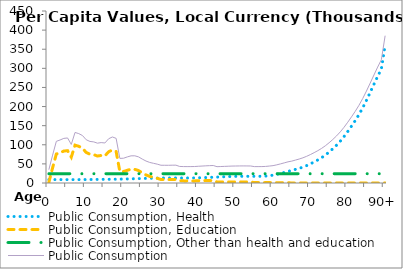
| Category | Public Consumption, Health | Public Consumption, Education | Public Consumption, Other than health and education | Public Consumption |
|---|---|---|---|---|
| 0 | 8886.3 | 1683.394 | 24310.147 | 34879.841 |
|  | 8886.3 | 39695.76 | 24310.147 | 72892.206 |
| 2 | 8886.3 | 75808.341 | 24310.147 | 109004.787 |
| 3 | 8886.3 | 79378.98 | 24310.147 | 112575.426 |
| 4 | 8886.3 | 83548.309 | 24310.147 | 116744.755 |
| 5 | 8886.3 | 84640.315 | 24310.147 | 117836.761 |
| 6 | 8886.3 | 67719.116 | 24310.147 | 100915.563 |
| 7 | 8889.363 | 99023.447 | 24310.147 | 132222.957 |
| 8 | 8906.819 | 96012.027 | 24310.147 | 129228.992 |
| 9 | 8947.693 | 90871.496 | 24310.147 | 124129.336 |
| 10 | 9014.393 | 79808.508 | 24310.147 | 113133.048 |
| 11 | 9103.403 | 75315.585 | 24310.147 | 108729.135 |
| 12 | 9208.155 | 74071.104 | 24310.147 | 107589.406 |
| 13 | 9321.862 | 70594.53 | 24310.147 | 104226.538 |
| 14 | 9439.269 | 71991.213 | 24310.147 | 105740.628 |
| 15 | 9557.561 | 70862.256 | 24310.147 | 104729.964 |
| 16 | 9675.72 | 81791.858 | 24310.147 | 115777.724 |
| 17 | 9798.338 | 86255.72 | 24310.147 | 120364.205 |
| 18 | 9947.251 | 82592.397 | 24310.147 | 116849.796 |
| 19 | 10137.665 | 29873.063 | 24310.147 | 64320.875 |
| 20 | 10368.694 | 30196.056 | 24310.147 | 64874.897 |
| 21 | 10628.242 | 33355.121 | 24310.147 | 68293.51 |
| 22 | 10902.519 | 35867.907 | 24310.147 | 71080.572 |
| 23 | 11183.609 | 35666.717 | 24310.147 | 71160.472 |
| 24 | 11469.481 | 32538.88 | 24310.147 | 68318.508 |
| 25 | 11756.177 | 26493.437 | 24310.147 | 62559.761 |
| 26 | 12041.297 | 21106.336 | 24310.147 | 57457.779 |
| 27 | 12317.927 | 17165.314 | 24310.147 | 53793.387 |
| 28 | 12573.061 | 14642.946 | 24310.147 | 51526.154 |
| 29 | 12789.913 | 12227.189 | 24310.147 | 49327.249 |
| 30 | 12952.413 | 9193.019 | 24310.147 | 46455.578 |
| 31 | 13051.994 | 9013.917 | 24310.147 | 46376.058 |
| 32 | 13094.433 | 8921.66 | 24310.147 | 46326.239 |
| 33 | 13101.984 | 9178.733 | 24310.147 | 46590.863 |
| 34 | 13101.984 | 9239.283 | 24310.147 | 46651.413 |
| 35 | 13101.984 | 5885.431 | 24310.147 | 43297.561 |
| 36 | 13101.984 | 5566.392 | 24310.147 | 42978.522 |
| 37 | 13113.143 | 5489.964 | 24310.147 | 42913.254 |
| 38 | 13175.873 | 5471.257 | 24310.147 | 42957.277 |
| 39 | 13323.063 | 5466.551 | 24310.147 | 43099.76 |
| 40 | 13563.253 | 5869.607 | 24310.147 | 43743.006 |
| 41 | 13883.78 | 6141.374 | 24310.147 | 44335.301 |
| 42 | 14260.821 | 6329.827 | 24310.147 | 44900.795 |
| 43 | 14669.303 | 6407.946 | 24310.147 | 45387.396 |
| 44 | 15089.794 | 6345.566 | 24310.147 | 45745.507 |
| 45 | 15512.02 | 2887.684 | 24310.147 | 42709.851 |
| 46 | 15932.512 | 2848.984 | 24310.147 | 43091.642 |
| 47 | 16340.994 | 2835.708 | 24310.147 | 43486.848 |
| 48 | 16718.035 | 2874.449 | 24310.147 | 43902.63 |
| 49 | 17038.561 | 2931.93 | 24310.147 | 44280.637 |
| 50 | 17278.751 | 2862.721 | 24310.147 | 44451.618 |
| 51 | 17425.942 | 2881.717 | 24310.147 | 44617.805 |
| 52 | 17488.671 | 2907.81 | 24310.147 | 44706.627 |
| 53 | 17499.831 | 2793.558 | 24310.147 | 44603.535 |
| 54 | 17499.831 | 2696.621 | 24310.147 | 44506.599 |
| 55 | 17499.831 | 1095.177 | 24310.147 | 42905.154 |
| 56 | 17499.831 | 1086.588 | 24310.147 | 42896.566 |
| 57 | 17571.364 | 1076.074 | 24310.147 | 42957.585 |
| 58 | 17973.45 | 1087.222 | 24310.147 | 43370.818 |
| 59 | 18916.916 | 1106.913 | 24310.147 | 44333.976 |
| 60 | 20456.491 | 649.717 | 24310.147 | 45416.355 |
| 61 | 22511.019 | 706.68 | 24310.147 | 47527.847 |
| 62 | 24927.793 | 792.985 | 24310.147 | 50030.924 |
| 63 | 27546.094 | 832.418 | 24310.147 | 52688.659 |
| 64 | 30241.375 | 831.431 | 24310.147 | 55382.953 |
| 65 | 32947.775 | 0 | 24310.147 | 57257.922 |
| 66 | 35643.058 | 0 | 24310.147 | 59953.205 |
| 67 | 38402.228 | 0 | 24310.147 | 62712.375 |
| 68 | 41610.817 | 0 | 24310.147 | 65920.964 |
| 69 | 45523.283 | 0 | 24310.147 | 69833.43 |
| 70 | 50094.702 | 0 | 24310.147 | 74404.848 |
| 71 | 55084.088 | 0 | 24310.147 | 79394.235 |
| 72 | 60361.791 | 0 | 24310.147 | 84671.938 |
| 73 | 66243.395 | 0 | 24310.147 | 90553.542 |
| 74 | 73085.528 | 0 | 24310.147 | 97395.674 |
| 75 | 80919.032 | 0 | 24310.147 | 105229.179 |
| 76 | 89568.125 | 0 | 24310.147 | 113878.272 |
| 77 | 98925.613 | 0 | 24310.147 | 123235.76 |
| 78 | 109465.603 | 0 | 24310.147 | 133775.75 |
| 79 | 121467.318 | 0 | 24310.147 | 145777.465 |
| 80 | 134730.164 | 0 | 24310.147 | 159040.311 |
| 81 | 148750.845 | 0 | 24310.147 | 173060.992 |
| 82 | 163265.751 | 0 | 24310.147 | 187575.898 |
| 83 | 179015.731 | 0 | 24310.147 | 203325.878 |
| 84 | 196703.146 | 0 | 24310.147 | 221013.293 |
| 85 | 216211.314 | 0 | 24310.147 | 240521.461 |
| 86 | 236967.871 | 0 | 24310.147 | 261278.018 |
| 87 | 258142.26 | 0 | 24310.147 | 282452.407 |
| 88 | 278900.44 | 0 | 24310.147 | 303210.587 |
| 89 | 298508.51 | 0 | 24310.147 | 322818.657 |
| 90+ | 361075.569 | 0 | 24310.147 | 385385.716 |